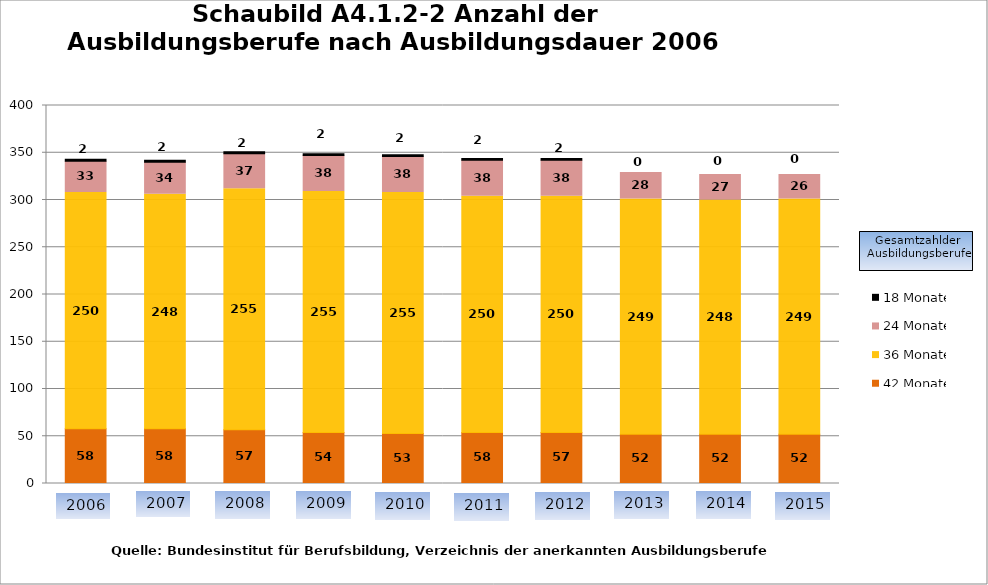
| Category | 42 Monate | 36 Monate | 24 Monate | 18 Monate |
|---|---|---|---|---|
| 0 | 58 | 250 | 33 | 2 |
| 1 | 58 | 248 | 34 | 2 |
| 2 | 57 | 255 | 37 | 2 |
| 3 | 54 | 255 | 38 | 2 |
| 4 | 53 | 255 | 38 | 2 |
| 5 | 54 | 250 | 38 | 2 |
| 6 | 54 | 250 | 38 | 2 |
| 7 | 52 | 249 | 28 | 0 |
| 8 | 52 | 248 | 27 | 0 |
| 9 | 52 | 249 | 26 | 0 |